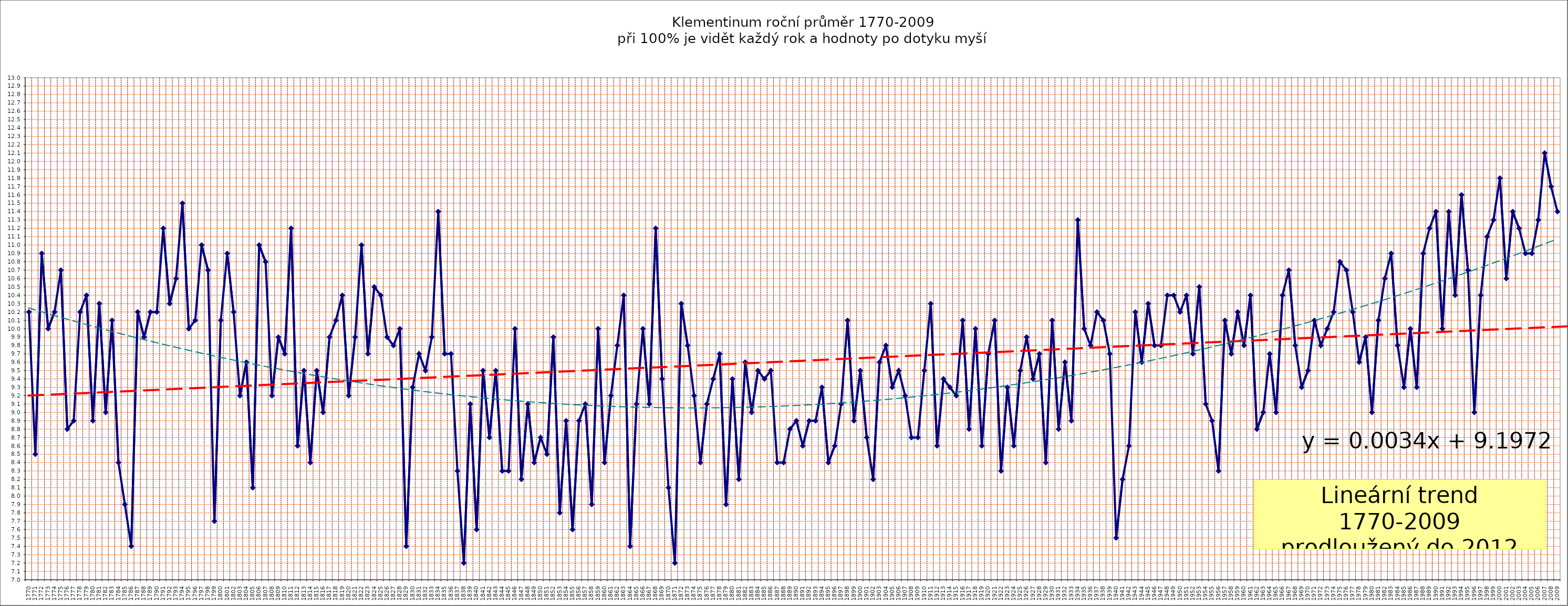
| Category | teplota |
|---|---|
| 1770.0 | 10.2 |
| 1771.0 | 8.5 |
| 1772.0 | 10.9 |
| 1773.0 | 10 |
| 1774.0 | 10.2 |
| 1775.0 | 10.7 |
| 1776.0 | 8.8 |
| 1777.0 | 8.9 |
| 1778.0 | 10.2 |
| 1779.0 | 10.4 |
| 1780.0 | 8.9 |
| 1781.0 | 10.3 |
| 1782.0 | 9 |
| 1783.0 | 10.1 |
| 1784.0 | 8.4 |
| 1785.0 | 7.9 |
| 1786.0 | 7.4 |
| 1787.0 | 10.2 |
| 1788.0 | 9.9 |
| 1789.0 | 10.2 |
| 1790.0 | 10.2 |
| 1791.0 | 11.2 |
| 1792.0 | 10.3 |
| 1793.0 | 10.6 |
| 1794.0 | 11.5 |
| 1795.0 | 10 |
| 1796.0 | 10.1 |
| 1797.0 | 11 |
| 1798.0 | 10.7 |
| 1799.0 | 7.7 |
| 1800.0 | 10.1 |
| 1801.0 | 10.9 |
| 1802.0 | 10.2 |
| 1803.0 | 9.2 |
| 1804.0 | 9.6 |
| 1805.0 | 8.1 |
| 1806.0 | 11 |
| 1807.0 | 10.8 |
| 1808.0 | 9.2 |
| 1809.0 | 9.9 |
| 1810.0 | 9.7 |
| 1811.0 | 11.2 |
| 1812.0 | 8.6 |
| 1813.0 | 9.5 |
| 1814.0 | 8.4 |
| 1815.0 | 9.5 |
| 1816.0 | 9 |
| 1817.0 | 9.9 |
| 1818.0 | 10.1 |
| 1819.0 | 10.4 |
| 1820.0 | 9.2 |
| 1821.0 | 9.9 |
| 1822.0 | 11 |
| 1823.0 | 9.7 |
| 1824.0 | 10.5 |
| 1825.0 | 10.4 |
| 1826.0 | 9.9 |
| 1827.0 | 9.8 |
| 1828.0 | 10 |
| 1829.0 | 7.4 |
| 1830.0 | 9.3 |
| 1831.0 | 9.7 |
| 1832.0 | 9.5 |
| 1833.0 | 9.9 |
| 1834.0 | 11.4 |
| 1835.0 | 9.7 |
| 1836.0 | 9.7 |
| 1837.0 | 8.3 |
| 1838.0 | 7.2 |
| 1839.0 | 9.1 |
| 1840.0 | 7.6 |
| 1841.0 | 9.5 |
| 1842.0 | 8.7 |
| 1843.0 | 9.5 |
| 1844.0 | 8.3 |
| 1845.0 | 8.3 |
| 1846.0 | 10 |
| 1847.0 | 8.2 |
| 1848.0 | 9.1 |
| 1849.0 | 8.4 |
| 1850.0 | 8.7 |
| 1851.0 | 8.5 |
| 1852.0 | 9.9 |
| 1853.0 | 7.8 |
| 1854.0 | 8.9 |
| 1855.0 | 7.6 |
| 1856.0 | 8.9 |
| 1857.0 | 9.1 |
| 1858.0 | 7.9 |
| 1859.0 | 10 |
| 1860.0 | 8.4 |
| 1861.0 | 9.2 |
| 1862.0 | 9.8 |
| 1863.0 | 10.4 |
| 1864.0 | 7.4 |
| 1865.0 | 9.1 |
| 1866.0 | 10 |
| 1867.0 | 9.1 |
| 1868.0 | 11.2 |
| 1869.0 | 9.4 |
| 1870.0 | 8.1 |
| 1871.0 | 7.2 |
| 1872.0 | 10.3 |
| 1873.0 | 9.8 |
| 1874.0 | 9.2 |
| 1875.0 | 8.4 |
| 1876.0 | 9.1 |
| 1877.0 | 9.4 |
| 1878.0 | 9.7 |
| 1879.0 | 7.9 |
| 1880.0 | 9.4 |
| 1881.0 | 8.2 |
| 1882.0 | 9.6 |
| 1883.0 | 9 |
| 1884.0 | 9.5 |
| 1885.0 | 9.4 |
| 1886.0 | 9.5 |
| 1887.0 | 8.4 |
| 1888.0 | 8.4 |
| 1889.0 | 8.8 |
| 1890.0 | 8.9 |
| 1891.0 | 8.6 |
| 1892.0 | 8.9 |
| 1893.0 | 8.9 |
| 1894.0 | 9.3 |
| 1895.0 | 8.4 |
| 1896.0 | 8.6 |
| 1897.0 | 9.1 |
| 1898.0 | 10.1 |
| 1899.0 | 8.9 |
| 1900.0 | 9.5 |
| 1901.0 | 8.7 |
| 1902.0 | 8.2 |
| 1903.0 | 9.6 |
| 1904.0 | 9.8 |
| 1905.0 | 9.3 |
| 1906.0 | 9.5 |
| 1907.0 | 9.2 |
| 1908.0 | 8.7 |
| 1909.0 | 8.7 |
| 1910.0 | 9.5 |
| 1911.0 | 10.3 |
| 1912.0 | 8.6 |
| 1913.0 | 9.4 |
| 1914.0 | 9.3 |
| 1915.0 | 9.2 |
| 1916.0 | 10.1 |
| 1917.0 | 8.8 |
| 1918.0 | 10 |
| 1919.0 | 8.6 |
| 1920.0 | 9.7 |
| 1921.0 | 10.1 |
| 1922.0 | 8.3 |
| 1923.0 | 9.3 |
| 1924.0 | 8.6 |
| 1925.0 | 9.5 |
| 1926.0 | 9.9 |
| 1927.0 | 9.4 |
| 1928.0 | 9.7 |
| 1929.0 | 8.4 |
| 1930.0 | 10.1 |
| 1931.0 | 8.8 |
| 1932.0 | 9.6 |
| 1933.0 | 8.9 |
| 1934.0 | 11.3 |
| 1935.0 | 10 |
| 1936.0 | 9.8 |
| 1937.0 | 10.2 |
| 1938.0 | 10.1 |
| 1939.0 | 9.7 |
| 1940.0 | 7.5 |
| 1941.0 | 8.2 |
| 1942.0 | 8.6 |
| 1943.0 | 10.2 |
| 1944.0 | 9.6 |
| 1945.0 | 10.3 |
| 1946.0 | 9.8 |
| 1947.0 | 9.8 |
| 1948.0 | 10.4 |
| 1949.0 | 10.4 |
| 1950.0 | 10.2 |
| 1951.0 | 10.4 |
| 1952.0 | 9.7 |
| 1953.0 | 10.5 |
| 1954.0 | 9.1 |
| 1955.0 | 8.9 |
| 1956.0 | 8.3 |
| 1957.0 | 10.1 |
| 1958.0 | 9.7 |
| 1959.0 | 10.2 |
| 1960.0 | 9.8 |
| 1961.0 | 10.4 |
| 1962.0 | 8.8 |
| 1963.0 | 9 |
| 1964.0 | 9.7 |
| 1965.0 | 9 |
| 1966.0 | 10.4 |
| 1967.0 | 10.7 |
| 1968.0 | 9.8 |
| 1969.0 | 9.3 |
| 1970.0 | 9.5 |
| 1971.0 | 10.1 |
| 1972.0 | 9.8 |
| 1973.0 | 10 |
| 1974.0 | 10.2 |
| 1975.0 | 10.8 |
| 1976.0 | 10.7 |
| 1977.0 | 10.2 |
| 1978.0 | 9.6 |
| 1979.0 | 9.9 |
| 1980.0 | 9 |
| 1981.0 | 10.1 |
| 1982.0 | 10.6 |
| 1983.0 | 10.9 |
| 1984.0 | 9.8 |
| 1985.0 | 9.3 |
| 1986.0 | 10 |
| 1987.0 | 9.3 |
| 1988.0 | 10.9 |
| 1989.0 | 11.2 |
| 1990.0 | 11.4 |
| 1991.0 | 10 |
| 1992.0 | 11.4 |
| 1993.0 | 10.4 |
| 1994.0 | 11.6 |
| 1995.0 | 10.7 |
| 1996.0 | 9 |
| 1997.0 | 10.4 |
| 1998.0 | 11.1 |
| 1999.0 | 11.3 |
| 2000.0 | 11.8 |
| 2001.0 | 10.6 |
| 2002.0 | 11.4 |
| 2003.0 | 11.2 |
| 2004.0 | 10.9 |
| 2005.0 | 10.9 |
| 2006.0 | 11.3 |
| 2007.0 | 12.1 |
| 2008.0 | 11.7 |
| 2009.0 | 11.4 |